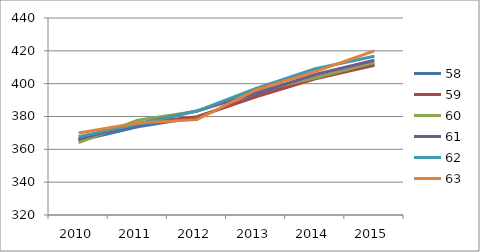
| Category | 58 | 59 | 60 | 61 | 62 | 63 |
|---|---|---|---|---|---|---|
| 2010.0 | 365.264 | 366.022 | 364.038 | 366.467 | 367.685 | 369.989 |
| 2011.0 | 373.733 | 375.869 | 377.706 | 375.456 | 375.461 | 375.981 |
| 2012.0 | 379.574 | 379.837 | 383.188 | 383.423 | 383.326 | 378.095 |
| 2013.0 | 392.747 | 391.915 | 395.244 | 394.071 | 397.175 | 396.28 |
| 2014.0 | 403.763 | 402.917 | 403.537 | 405.559 | 409.108 | 407.341 |
| 2015.0 | 412.014 | 411.261 | 412.884 | 414.301 | 416.727 | 419.953 |